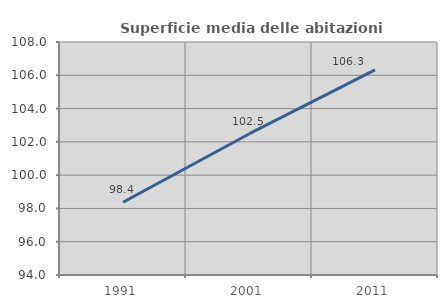
| Category | Superficie media delle abitazioni occupate |
|---|---|
| 1991.0 | 98.37 |
| 2001.0 | 102.475 |
| 2011.0 | 106.327 |